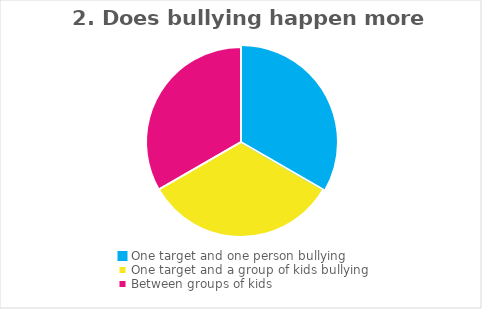
| Category | Field1 |
|---|---|
| One target and one person bullying | 1 |
| One target and a group of kids bullying | 1 |
| Between groups of kids | 1 |